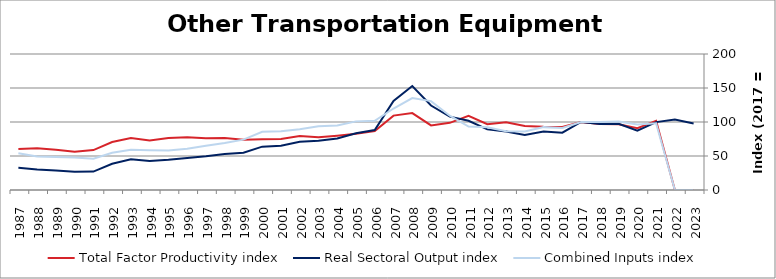
| Category | Total Factor Productivity index | Real Sectoral Output index | Combined Inputs index |
|---|---|---|---|
| 2023.0 | 0 | 97.914 | 0 |
| 2022.0 | 0 | 103.597 | 0 |
| 2021.0 | 101.718 | 99.804 | 98.118 |
| 2020.0 | 90.767 | 87.285 | 96.164 |
| 2019.0 | 96.744 | 97.313 | 100.588 |
| 2018.0 | 97.154 | 97.088 | 99.931 |
| 2017.0 | 100 | 100 | 100 |
| 2016.0 | 92.583 | 84.32 | 91.075 |
| 2015.0 | 92.975 | 85.965 | 92.46 |
| 2014.0 | 94.173 | 80.922 | 85.929 |
| 2013.0 | 99.481 | 86.073 | 86.522 |
| 2012.0 | 96.672 | 89.147 | 92.215 |
| 2011.0 | 109.133 | 101.728 | 93.215 |
| 2010.0 | 98.764 | 107.916 | 109.266 |
| 2009.0 | 95.027 | 124.223 | 130.723 |
| 2008.0 | 113.124 | 152.832 | 135.101 |
| 2007.0 | 109.367 | 131.047 | 119.823 |
| 2006.0 | 86.684 | 88.203 | 101.752 |
| 2005.0 | 82.778 | 83.539 | 100.919 |
| 2004.0 | 79.794 | 75.68 | 94.845 |
| 2003.0 | 77.408 | 72.484 | 93.638 |
| 2002.0 | 79.243 | 70.922 | 89.499 |
| 2001.0 | 75.134 | 64.958 | 86.456 |
| 2000.0 | 74.519 | 63.767 | 85.571 |
| 1999.0 | 73.936 | 54.752 | 74.054 |
| 1998.0 | 76.349 | 52.833 | 69.199 |
| 1997.0 | 76.049 | 49.608 | 65.232 |
| 1996.0 | 77.647 | 47.149 | 60.723 |
| 1995.0 | 76.364 | 44.496 | 58.269 |
| 1994.0 | 72.893 | 42.696 | 58.573 |
| 1993.0 | 76.528 | 45.223 | 59.094 |
| 1992.0 | 70.598 | 38.586 | 54.656 |
| 1991.0 | 58.652 | 27.063 | 46.142 |
| 1990.0 | 56.319 | 26.873 | 47.716 |
| 1989.0 | 59.289 | 28.738 | 48.472 |
| 1988.0 | 61.3 | 30.258 | 49.361 |
| 1987.0 | 60.14 | 32.572 | 54.161 |